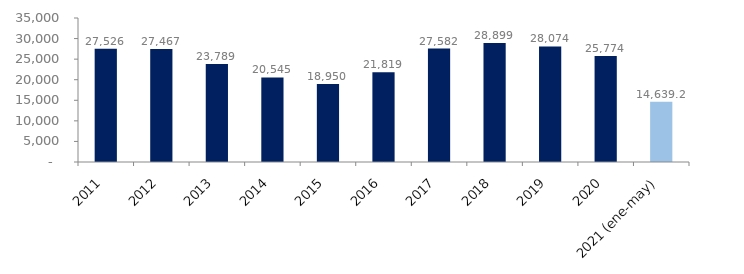
| Category | Series 1 |
|---|---|
| 2011 | 27525.675 |
| 2012 | 27466.673 |
| 2013 | 23789.445 |
| 2014 | 20545.414 |
| 2015 | 18950.14 |
| 2016 | 21819.079 |
| 2017 | 27581.607 |
| 2018 | 28898.658 |
| 2019 | 28073.793 |
| 2020 | 25773.552 |
| 2021 (ene-may) | 14639.219 |